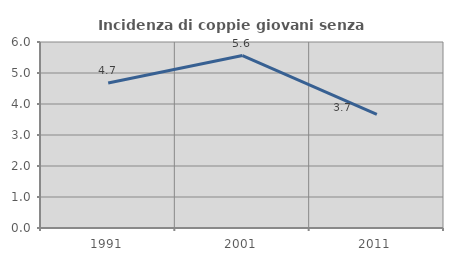
| Category | Incidenza di coppie giovani senza figli |
|---|---|
| 1991.0 | 4.679 |
| 2001.0 | 5.564 |
| 2011.0 | 3.664 |